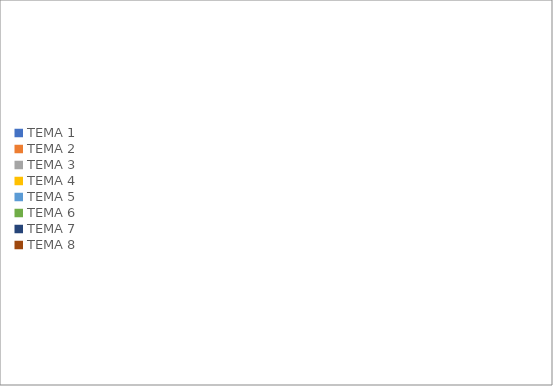
| Category | Series 0 | Series 1 |
|---|---|---|
| TEMA 1 | 0 | 0 |
| TEMA 2 | 0 | 0 |
| TEMA 3 | 0 | 0 |
| TEMA 4 | 0 | 0 |
| TEMA 5 | 0 | 0 |
| TEMA 6 | 0 | 0 |
| TEMA 7 | 0 | 0 |
| TEMA 8 | 0 | 0 |